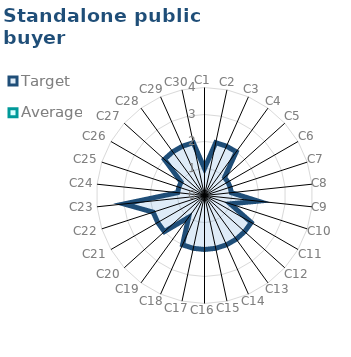
| Category | Target | Average |
|---|---|---|
| C1 | 1 | 0 |
| C2 | 2 | 0 |
| C3 | 2 | 0 |
| C4 | 2 | 0 |
| C5 | 1 | 0 |
| C6 | 1 | 0 |
| C7 | 1 | 0 |
| C8 | 1 | 0 |
| C9 | 2 | 0 |
| C10 | 1 | 0 |
| C11 | 2 | 0 |
| C12 | 2 | 0 |
| C13 | 2 | 0 |
| C14 | 2 | 0 |
| C15 | 2 | 0 |
| C16 | 2 | 0 |
| C17 | 2 | 0 |
| C18 | 2 | 0 |
| C19 | 1 | 0 |
| C20 | 2 | 0 |
| C21 | 2 | 0 |
| C22 | 2 | 0 |
| C23 | 3 | 0 |
| C24 | 1 | 0 |
| C25 | 1 | 0 |
| C26 | 1 | 0 |
| C27 | 2 | 0 |
| C28 | 2 | 0 |
| C29 | 2 | 0 |
| C30 | 2 | 0 |